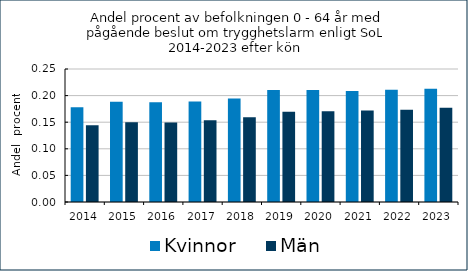
| Category | Kvinnor    | Män   |
|---|---|---|
| 2014.0 | 0.178 | 0.144 |
| 2015.0 | 0.188 | 0.15 |
| 2016.0 | 0.188 | 0.149 |
| 2017.0 | 0.189 | 0.154 |
| 2018.0 | 0.195 | 0.159 |
| 2019.0 | 0.21 | 0.17 |
| 2020.0 | 0.211 | 0.171 |
| 2021.0 | 0.209 | 0.172 |
| 2022.0 | 0.211 | 0.173 |
| 2023.0 | 0.213 | 0.177 |